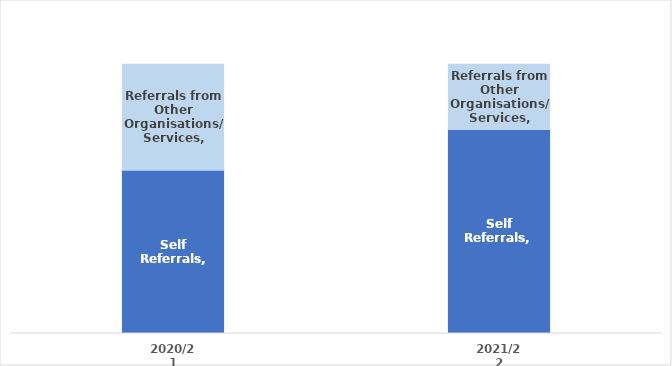
| Category | Total self-referrals | Total referrals from other organisations/services |
|---|---|---|
| 2020/21 | 0.606 | 0.394 |
| 2021/22 | 0.758 | 0.242 |